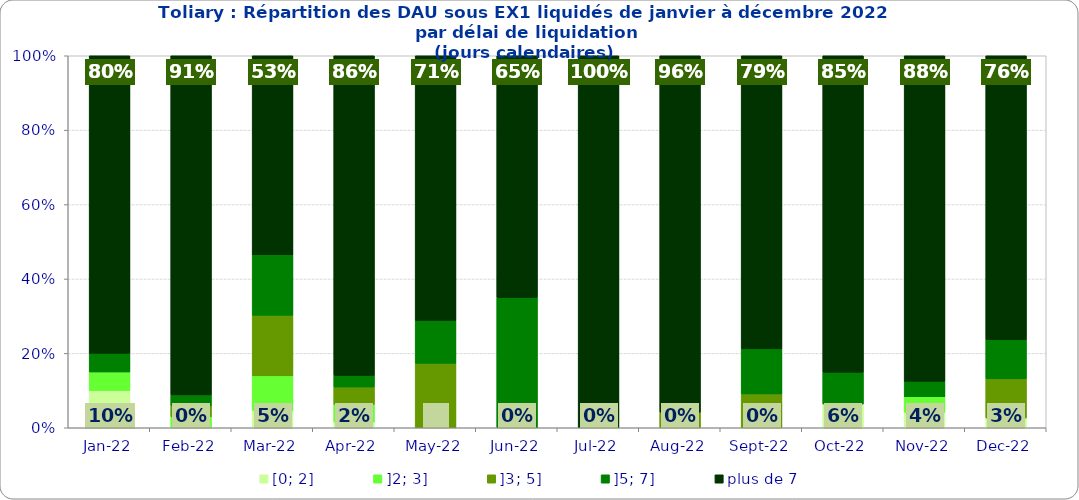
| Category | [0; 2] | ]2; 3] | ]3; 5] | ]5; 7] | plus de 7 |
|---|---|---|---|---|---|
| 2022-01-01 | 0.1 | 0.05 | 0 | 0.05 | 0.8 |
| 2022-02-01 | 0 | 0.029 | 0.029 | 0.029 | 0.912 |
| 2022-03-01 | 0.047 | 0.093 | 0.163 | 0.163 | 0.535 |
| 2022-04-01 | 0.016 | 0.047 | 0.047 | 0.031 | 0.859 |
| 2022-05-01 | 0 | 0 | 0.173 | 0.115 | 0.712 |
| 2022-06-01 | 0 | 0 | 0 | 0.35 | 0.65 |
| 2022-07-01 | 0 | 0 | 0 | 0 | 1 |
| 2022-08-01 | 0 | 0 | 0.042 | 0 | 0.958 |
| 2022-09-01 | 0 | 0 | 0.091 | 0.121 | 0.788 |
| 2022-10-01 | 0.064 | 0 | 0 | 0.085 | 0.851 |
| 2022-11-01 | 0.042 | 0.042 | 0 | 0.042 | 0.875 |
| 2022-12-01 | 0.026 | 0 | 0.105 | 0.105 | 0.763 |